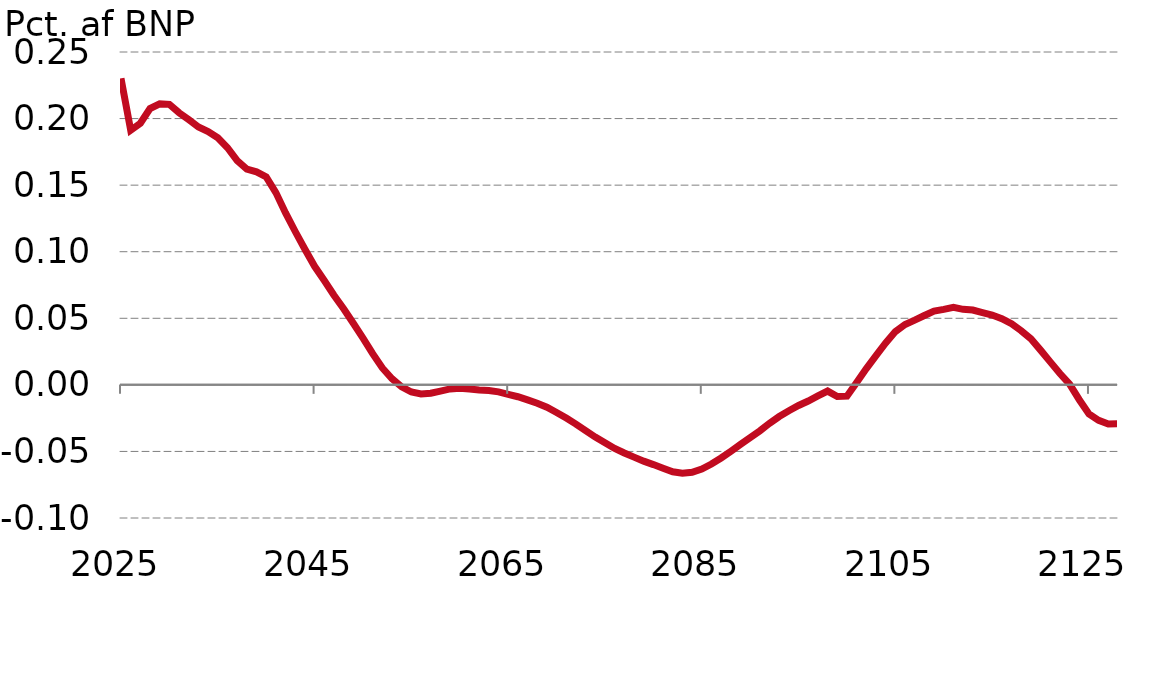
| Category |  Serie1 |
|---|---|
| 0 | 0.23 |
| 1 | 0.191 |
| 2 | 0.197 |
| 3 | 0.208 |
| 4 | 0.211 |
| 5 | 0.211 |
| 6 | 0.204 |
| 7 | 0.199 |
| 8 | 0.194 |
| 9 | 0.19 |
| 10 | 0.186 |
| 11 | 0.178 |
| 12 | 0.168 |
| 13 | 0.162 |
| 14 | 0.16 |
| 15 | 0.156 |
| 16 | 0.144 |
| 17 | 0.129 |
| 18 | 0.115 |
| 19 | 0.102 |
| 20 | 0.089 |
| 21 | 0.078 |
| 22 | 0.067 |
| 23 | 0.057 |
| 24 | 0.046 |
| 25 | 0.035 |
| 26 | 0.023 |
| 27 | 0.013 |
| 28 | 0.005 |
| 29 | -0.001 |
| 30 | -0.005 |
| 31 | -0.007 |
| 32 | -0.006 |
| 33 | -0.005 |
| 34 | -0.003 |
| 35 | -0.002 |
| 36 | -0.003 |
| 37 | -0.004 |
| 38 | -0.004 |
| 39 | -0.005 |
| 40 | -0.007 |
| 41 | -0.009 |
| 42 | -0.011 |
| 43 | -0.014 |
| 44 | -0.017 |
| 45 | -0.021 |
| 46 | -0.025 |
| 47 | -0.029 |
| 48 | -0.034 |
| 49 | -0.039 |
| 50 | -0.043 |
| 51 | -0.048 |
| 52 | -0.051 |
| 53 | -0.054 |
| 54 | -0.057 |
| 55 | -0.06 |
| 56 | -0.063 |
| 57 | -0.065 |
| 58 | -0.066 |
| 59 | -0.066 |
| 60 | -0.063 |
| 61 | -0.059 |
| 62 | -0.055 |
| 63 | -0.05 |
| 64 | -0.045 |
| 65 | -0.04 |
| 66 | -0.035 |
| 67 | -0.029 |
| 68 | -0.024 |
| 69 | -0.019 |
| 70 | -0.015 |
| 71 | -0.012 |
| 72 | -0.008 |
| 73 | -0.005 |
| 74 | -0.009 |
| 75 | -0.008 |
| 76 | 0.002 |
| 77 | 0.012 |
| 78 | 0.022 |
| 79 | 0.031 |
| 80 | 0.04 |
| 81 | 0.045 |
| 82 | 0.049 |
| 83 | 0.052 |
| 84 | 0.055 |
| 85 | 0.057 |
| 86 | 0.058 |
| 87 | 0.057 |
| 88 | 0.056 |
| 89 | 0.054 |
| 90 | 0.052 |
| 91 | 0.05 |
| 92 | 0.046 |
| 93 | 0.041 |
| 94 | 0.035 |
| 95 | 0.026 |
| 96 | 0.017 |
| 97 | 0.009 |
| 98 | 0 |
| 99 | -0.011 |
| 100 | -0.022 |
| 101 | -0.027 |
| 102 | -0.029 |
| 103 | -0.029 |